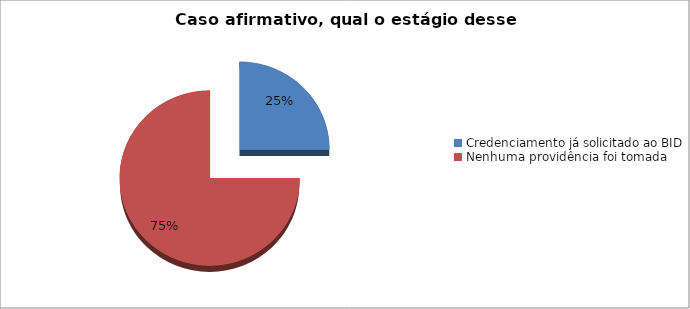
| Category | Series 0 |
|---|---|
| Credenciamento já solicitado ao BID | 0.25 |
| Nenhuma providência foi tomada | 0.75 |